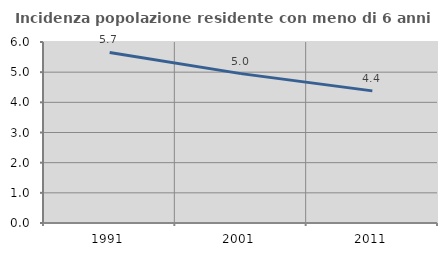
| Category | Incidenza popolazione residente con meno di 6 anni |
|---|---|
| 1991.0 | 5.654 |
| 2001.0 | 4.952 |
| 2011.0 | 4.38 |